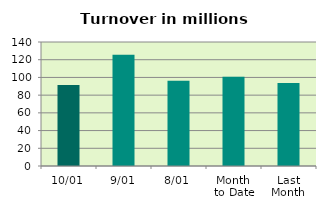
| Category | Series 0 |
|---|---|
| 10/01 | 91.43 |
| 9/01 | 125.561 |
| 8/01 | 96.299 |
| Month 
to Date | 100.898 |
| Last
Month | 93.592 |